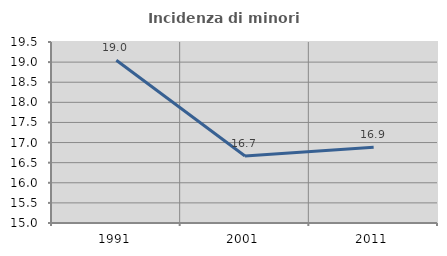
| Category | Incidenza di minori stranieri |
|---|---|
| 1991.0 | 19.048 |
| 2001.0 | 16.667 |
| 2011.0 | 16.883 |